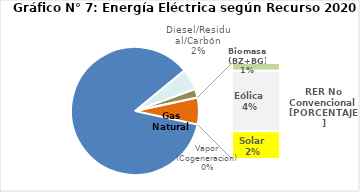
| Category | Series 0 |
|---|---|
| Agua | 2818.875 |
| Gas Natural | 176.843 |
| Diesel/Residual/Carbón | 71.226 |
| Vapor (Cogeneracion) | 0.15 |
| Biomasa (BZ+BG) | 17.844 |
| Eólica | 141.381 |
| Solar | 64.588 |